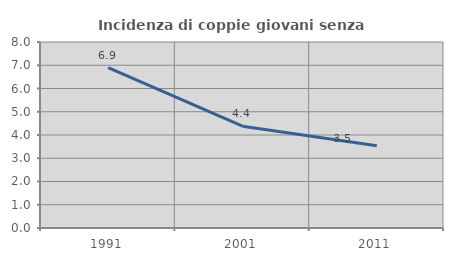
| Category | Incidenza di coppie giovani senza figli |
|---|---|
| 1991.0 | 6.893 |
| 2001.0 | 4.379 |
| 2011.0 | 3.541 |